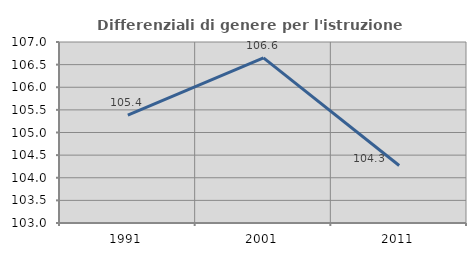
| Category | Differenziali di genere per l'istruzione superiore |
|---|---|
| 1991.0 | 105.383 |
| 2001.0 | 106.649 |
| 2011.0 | 104.27 |